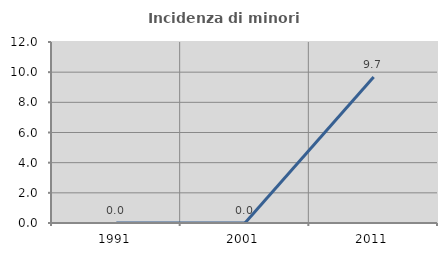
| Category | Incidenza di minori stranieri |
|---|---|
| 1991.0 | 0 |
| 2001.0 | 0 |
| 2011.0 | 9.677 |